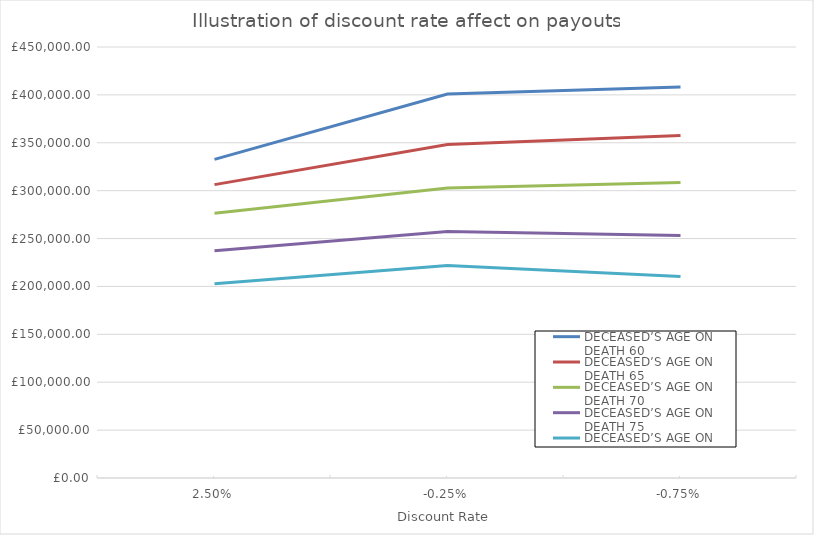
| Category | DECEASED’S AGE ON DEATH |
|---|---|
| 0.025 | 202831 |
| -0.0025 | 221895.7 |
| -0.0075 | 210301 |